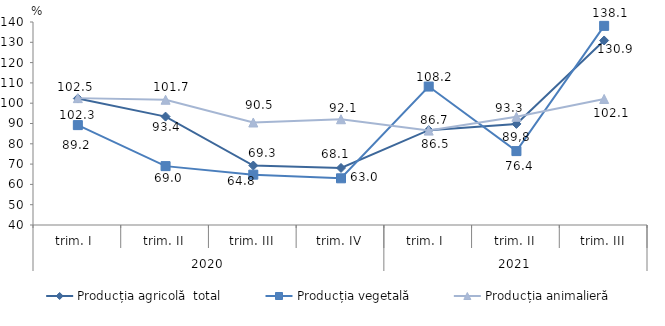
| Category | Producția agricolă  total | Producția vegetală | Producția animalieră |
|---|---|---|---|
| 0 | 102.3 | 89.2 | 102.5 |
| 1 | 93.4 | 69 | 101.7 |
| 2 | 69.3 | 64.8 | 90.5 |
| 3 | 68.1 | 63 | 92.1 |
| 4 | 86.7 | 108.2 | 86.5 |
| 5 | 89.8 | 76.4 | 93.3 |
| 6 | 130.9 | 138.1 | 102.1 |